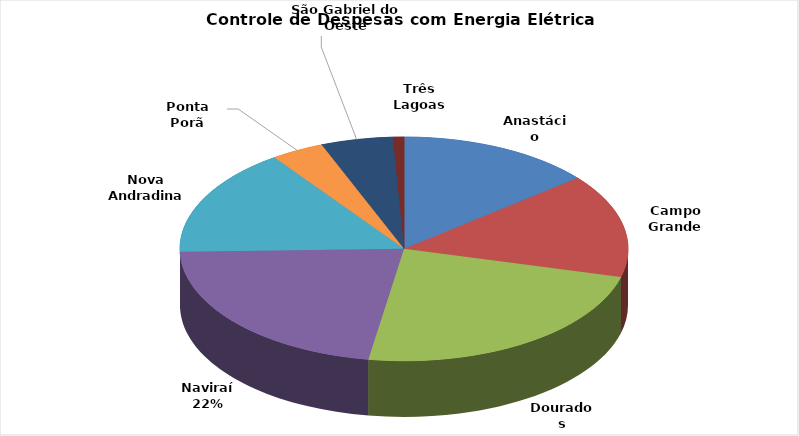
| Category | Series 0 |
|---|---|
| Anastácio | 10807.1 |
| Campo Grande | 11460.5 |
| Dourados | 18019.77 |
| Naviraí | 16898.06 |
| Nova Andradina | 11970.58 |
| Ponta Porã | 2934.61 |
| São Gabriel do Oeste | 3986.27 |
| Três Lagoas | 605.09 |